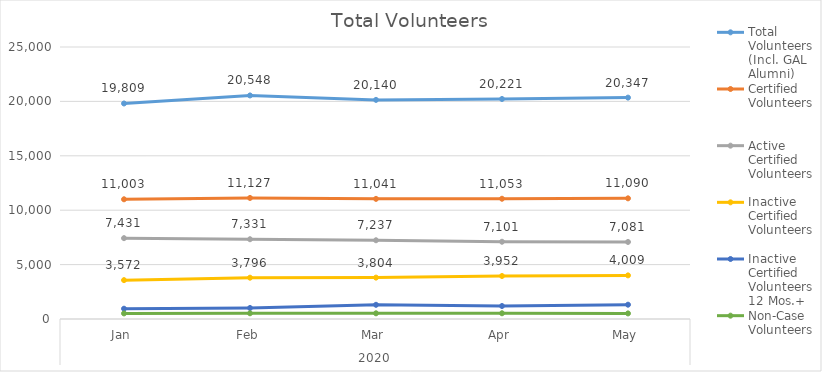
| Category | Total Volunteers (Incl. GAL Alumni)  | Certified Volunteers  | Active Certified Volunteers  | Inactive Certified Volunteers  | Inactive Certified Volunteers 12 Mos.+  | Non-Case Volunteers  |
|---|---|---|---|---|---|---|
| 0 | 19809 | 11003 | 7431 | 3572 | 945 | 514 |
| 1 | 20548 | 11127 | 7331 | 3796 | 1013 | 526 |
| 2 | 20140 | 11041 | 7237 | 3804 | 1305 | 523 |
| 3 | 20221 | 11053 | 7101 | 3952 | 1194 | 526 |
| 4 | 20347 | 11090 | 7081 | 4009 | 1315 | 514 |